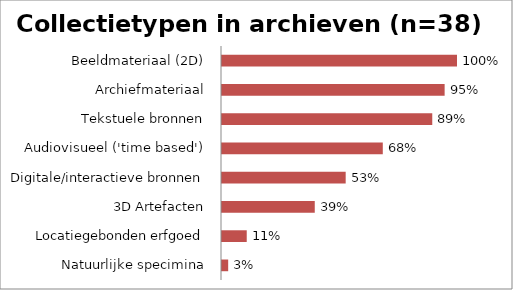
| Category | Archieven (n=38) |
|---|---|
| Natuurlijke specimina | 0.026 |
| Locatiegebonden erfgoed | 0.105 |
| 3D Artefacten | 0.395 |
| Digitale/interactieve bronnen | 0.526 |
| Audiovisueel ('time based') | 0.684 |
| Tekstuele bronnen | 0.895 |
| Archiefmateriaal | 0.947 |
| Beeldmateriaal (2D) | 1 |